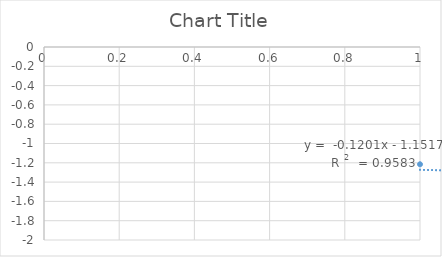
| Category | Series 0 |
|---|---|
| 0 | -1.215 |
| 1 | -1.446 |
| 2 | -1.566 |
| 3 | -1.588 |
| 4 | -1.748 |
| 5 | -1.871 |